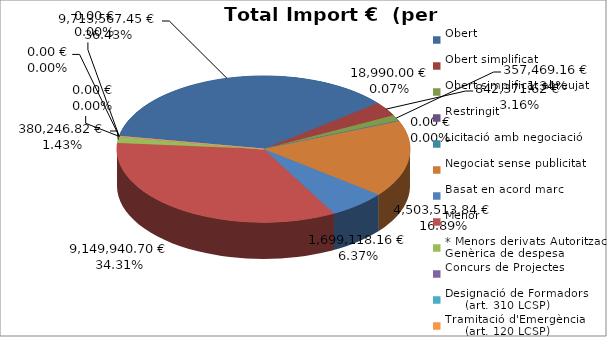
| Category | Total preu
(amb IVA) |
|---|---|
| Obert | 9713567.45 |
| Obert simplificat | 842371.62 |
| Obert simplificat abreujat | 357469.16 |
| Restringit | 0 |
| Licitació amb negociació | 18990 |
| Negociat sense publicitat | 4503513.84 |
| Basat en acord marc | 1699118.16 |
| Menor | 9149940.7 |
| * Menors derivats Autorització Genèrica de despesa | 380246.82 |
| Concurs de Projectes | 0 |
| Designació de Formadors
     (art. 310 LCSP) | 0 |
| Tramitació d'Emergència
     (art. 120 LCSP) | 0 |